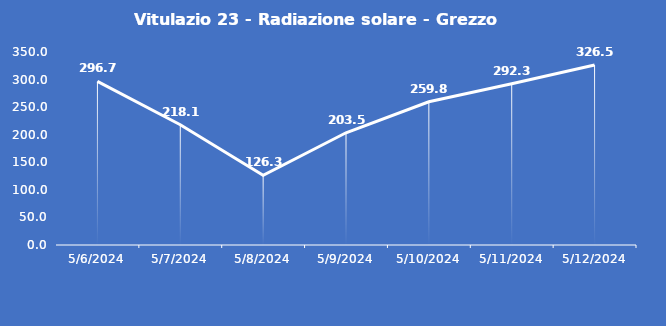
| Category | Vitulazio 23 - Radiazione solare - Grezzo (W/m2) |
|---|---|
| 5/6/24 | 296.7 |
| 5/7/24 | 218.1 |
| 5/8/24 | 126.3 |
| 5/9/24 | 203.5 |
| 5/10/24 | 259.8 |
| 5/11/24 | 292.3 |
| 5/12/24 | 326.5 |